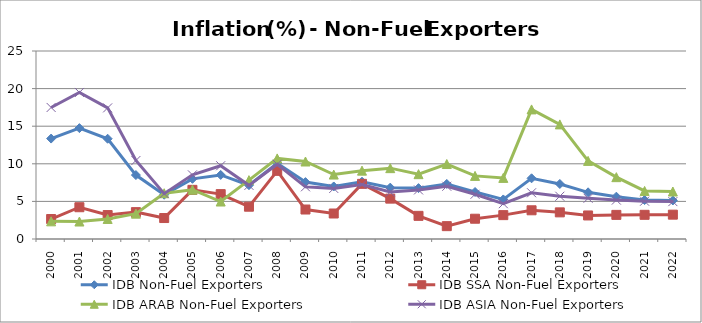
| Category | IDB Non-Fuel Exporters | IDB SSA Non-Fuel Exporters | IDB ARAB Non-Fuel Exporters | IDB ASIA Non-Fuel Exporters |
|---|---|---|---|---|
| 2000.0 | 13.356 | 2.657 | 2.35 | 17.489 |
| 2001.0 | 14.743 | 4.225 | 2.323 | 19.488 |
| 2002.0 | 13.333 | 3.183 | 2.665 | 17.435 |
| 2003.0 | 8.502 | 3.573 | 3.371 | 10.437 |
| 2004.0 | 5.887 | 2.787 | 6.085 | 6.034 |
| 2005.0 | 8.002 | 6.535 | 6.559 | 8.528 |
| 2006.0 | 8.521 | 5.969 | 4.985 | 9.744 |
| 2007.0 | 7.155 | 4.294 | 7.826 | 7.134 |
| 2008.0 | 10.072 | 9.062 | 10.717 | 9.94 |
| 2009.0 | 7.567 | 3.919 | 10.305 | 6.941 |
| 2010.0 | 6.985 | 3.39 | 8.569 | 6.727 |
| 2011.0 | 7.617 | 7.334 | 9.09 | 7.238 |
| 2012.0 | 6.83 | 5.368 | 9.421 | 6.246 |
| 2013.0 | 6.767 | 3.078 | 8.623 | 6.524 |
| 2014.0 | 7.319 | 1.709 | 9.97 | 7.011 |
| 2015.0 | 6.249 | 2.695 | 8.392 | 5.947 |
| 2016.0 | 5.261 | 3.174 | 8.126 | 4.698 |
| 2017.0 | 8.07 | 3.818 | 17.233 | 6.15 |
| 2018.0 | 7.318 | 3.542 | 15.24 | 5.685 |
| 2019.0 | 6.207 | 3.13 | 10.388 | 5.42 |
| 2020.0 | 5.629 | 3.207 | 8.223 | 5.176 |
| 2021.0 | 5.183 | 3.216 | 6.392 | 5.028 |
| 2022.0 | 5.127 | 3.237 | 6.316 | 4.973 |